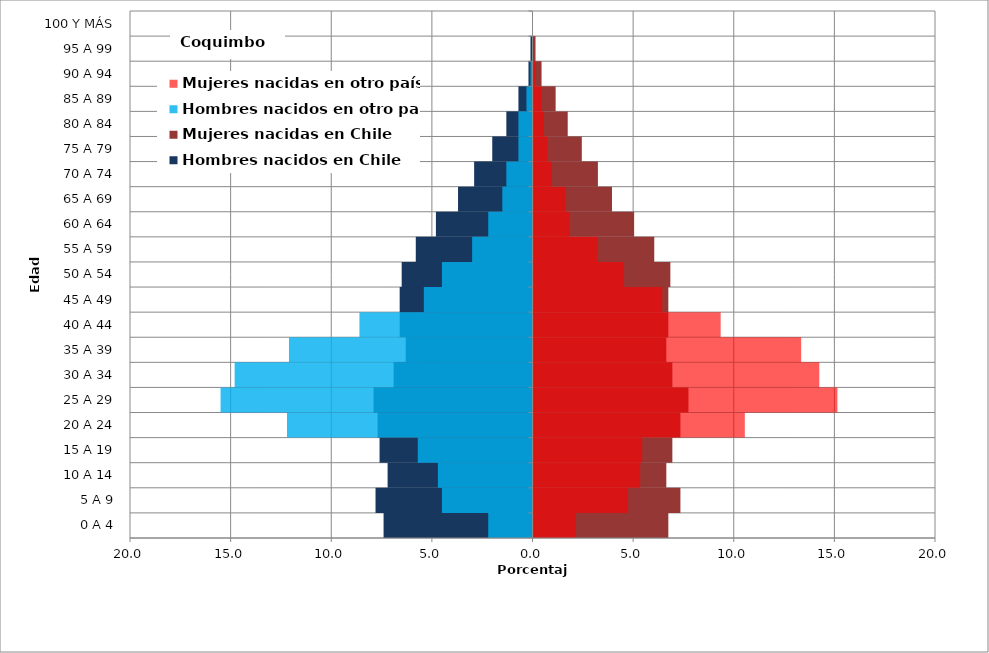
| Category | Hombres nacidos en Chile | Mujeres nacidas en Chile | Hombres nacidos en otro país | Mujeres nacidas en otro país |
|---|---|---|---|---|
| 0 A 4 | -7.4 | 6.7 | -2.2 | 2.1 |
| 5 A 9 | -7.8 | 7.3 | -4.5 | 4.7 |
| 10 A 14 | -7.2 | 6.6 | -4.7 | 5.3 |
| 15 A 19 | -7.6 | 6.9 | -5.7 | 5.4 |
| 20 A 24 | -7.7 | 7.3 | -12.2 | 10.5 |
| 25 A 29 | -7.9 | 7.7 | -15.5 | 15.1 |
| 30 A 34 | -6.9 | 6.9 | -14.8 | 14.2 |
| 35 A 39 | -6.3 | 6.6 | -12.1 | 13.3 |
| 40 A 44 | -6.6 | 6.7 | -8.6 | 9.3 |
| 45 A 49 | -6.6 | 6.7 | -5.4 | 6.4 |
| 50 A 54 | -6.5 | 6.8 | -4.5 | 4.5 |
| 55 A 59 | -5.8 | 6 | -3 | 3.2 |
| 60 A 64 | -4.8 | 5 | -2.2 | 1.8 |
| 65 A 69 | -3.7 | 3.9 | -1.5 | 1.6 |
| 70 A 74 | -2.9 | 3.2 | -1.3 | 0.9 |
| 75 A 79 | -2 | 2.4 | -0.7 | 0.7 |
| 80 A 84 | -1.3 | 1.7 | -0.7 | 0.5 |
| 85 A 89 | -0.7 | 1.1 | -0.3 | 0.4 |
| 90 A 94 | -0.2 | 0.4 | -0.1 | 0.1 |
| 95 A 99 | -0.1 | 0.1 | 0 | 0 |
| 100 Y MÁS | 0 | 0 | 0 | 0 |